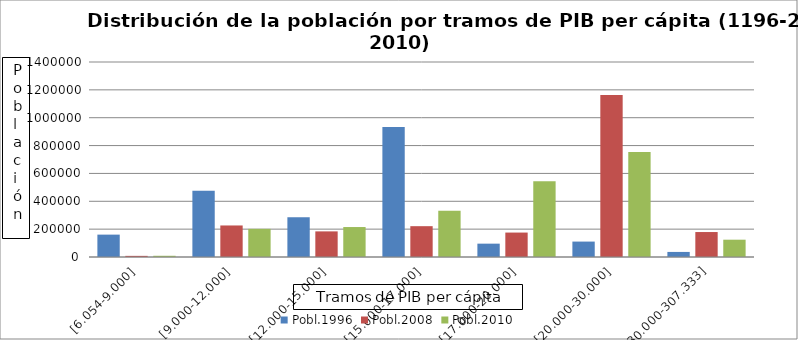
| Category | Pobl.1996 | Pobl.2008 | Pobl.2010 |
|---|---|---|---|
| [6.054-9.000] | 160674 | 8117 | 8732 |
| [9.000-12.000] | 476202 | 226407 | 201940 |
| [12.000-15.000] | 285422 | 183909 | 215112 |
| [15.000-17.000] | 932822 | 221319 | 331887 |
| [17.000-20.000] | 95812 | 175418 | 543360 |
| [20.000-30.000] | 110720 | 1162699 | 753077 |
| [30.000-307.333] | 36403 | 179244 | 124231 |